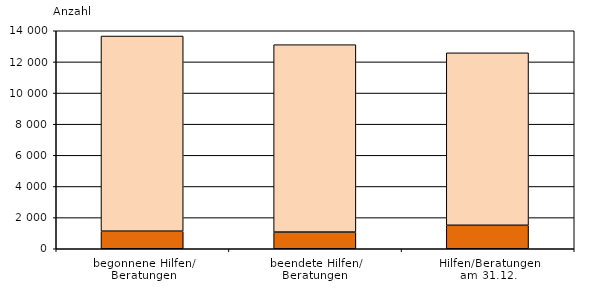
| Category | Series 0 | Series 1 |
|---|---|---|
| begonnene Hilfen/
Beratungen | 1129 | 12533 |
| beendete Hilfen/
Beratungen  | 1071 | 12035 |
| Hilfen/Beratungen
am 31.12. | 1508 | 11075 |